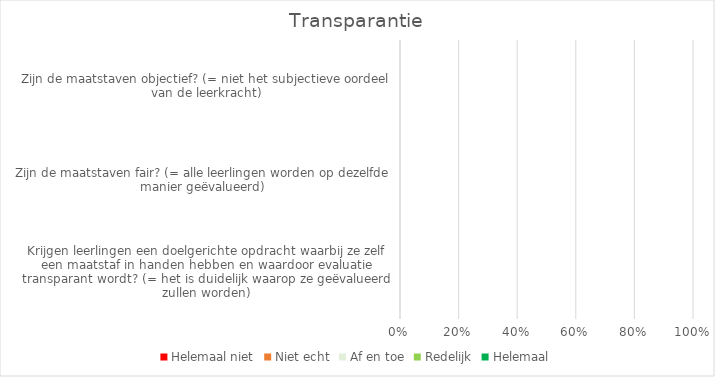
| Category | Helemaal niet | Niet echt | Af en toe | Redelijk | Helemaal |
|---|---|---|---|---|---|
| Krijgen leerlingen een doelgerichte opdracht waarbij ze zelf een maatstaf in handen hebben en waardoor evaluatie transparant wordt? (= het is duidelijk waarop ze geëvalueerd zullen worden) | 0 | 0 | 0 | 0 | 0 |
| Zijn de maatstaven fair? (= alle leerlingen worden op dezelfde manier geëvalueerd) | 0 | 0 | 0 | 0 | 0 |
| Zijn de maatstaven objectief? (= niet het subjectieve oordeel van de leerkracht) | 0 | 0 | 0 | 0 | 0 |